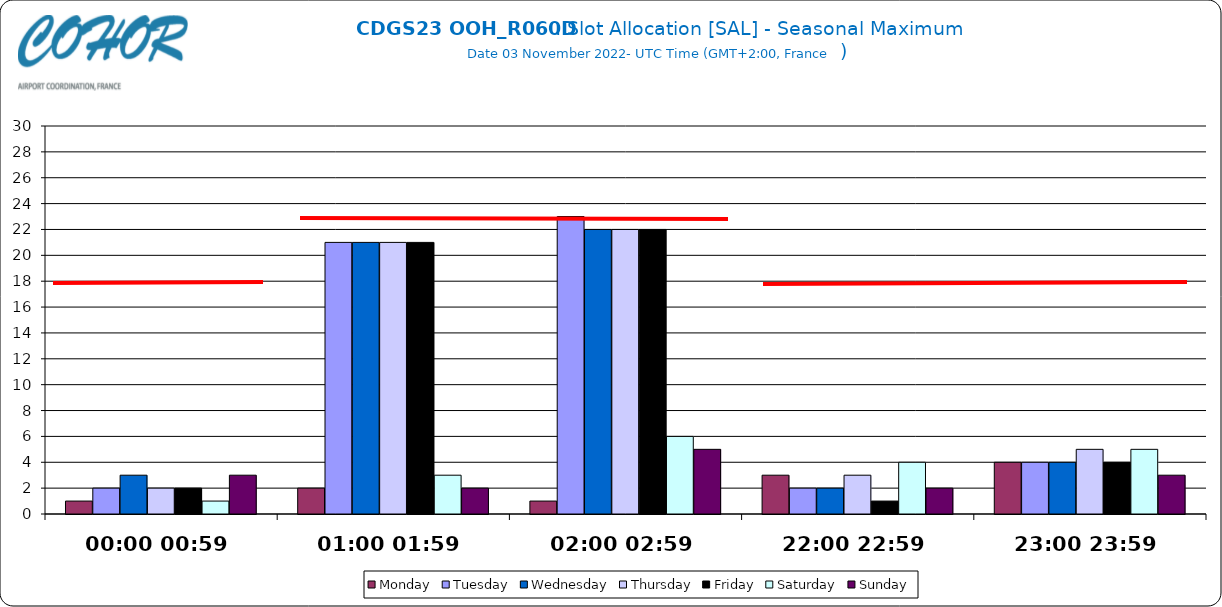
| Category | Monday | Tuesday | Wednesday | Thursday | Friday | Saturday | Sunday |
|---|---|---|---|---|---|---|---|
| 00:00 00:59 | 1 | 2 | 3 | 2 | 2 | 1 | 3 |
| 01:00 01:59 | 2 | 21 | 21 | 21 | 21 | 3 | 2 |
| 02:00 02:59 | 1 | 23 | 22 | 22 | 22 | 6 | 5 |
| 22:00 22:59 | 3 | 2 | 2 | 3 | 1 | 4 | 2 |
| 23:00 23:59 | 4 | 4 | 4 | 5 | 4 | 5 | 3 |